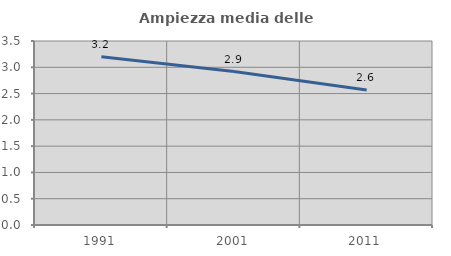
| Category | Ampiezza media delle famiglie |
|---|---|
| 1991.0 | 3.201 |
| 2001.0 | 2.918 |
| 2011.0 | 2.568 |